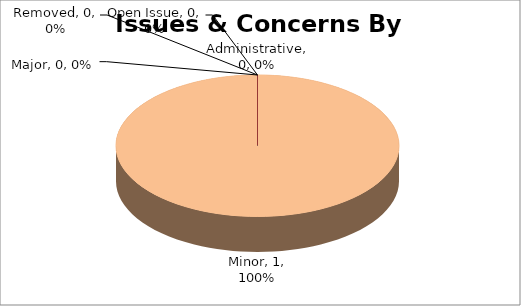
| Category | Series 1 |
|---|---|
| Major | 0 |
| Minor | 1 |
| Administrative | 0 |
| Open Issue | 0 |
| Removed | 0 |